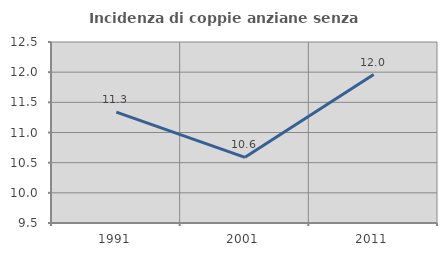
| Category | Incidenza di coppie anziane senza figli  |
|---|---|
| 1991.0 | 11.338 |
| 2001.0 | 10.588 |
| 2011.0 | 11.96 |